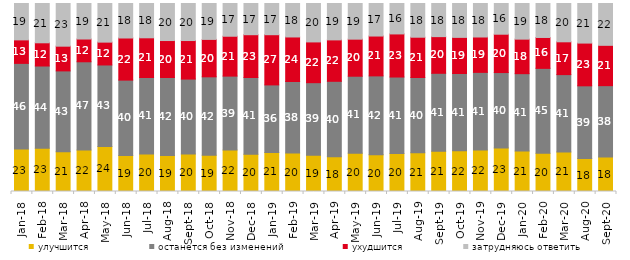
| Category | улучшится | останется без изменений | ухудшится | затрудняюсь ответить |
|---|---|---|---|---|
| 2018-01-01 | 22.55 | 45.6 | 12.5 | 19.35 |
| 2018-02-01 | 23 | 43.75 | 12.35 | 20.9 |
| 2018-03-01 | 21.15 | 43 | 13.15 | 22.7 |
| 2018-04-01 | 22.05 | 46.95 | 12.1 | 18.9 |
| 2018-05-01 | 23.95 | 43.35 | 12.15 | 20.55 |
| 2018-06-01 | 19.15 | 40.1 | 22.4 | 18.35 |
| 2018-07-01 | 19.95 | 40.7 | 21.1 | 18.25 |
| 2018-08-01 | 19.15 | 41.5 | 19.65 | 19.7 |
| 2018-09-01 | 19.95 | 39.85 | 20.5 | 19.7 |
| 2018-10-01 | 19.3 | 41.7 | 19.9 | 19.1 |
| 2018-11-01 | 22.056 | 39.321 | 21.208 | 17.415 |
| 2018-12-01 | 19.8 | 40.85 | 22.75 | 16.6 |
| 2019-01-01 | 20.75 | 35.95 | 26.7 | 16.6 |
| 2019-02-01 | 20.45 | 38.05 | 23.7 | 17.8 |
| 2019-03-01 | 19.344 | 38.538 | 21.681 | 20.438 |
| 2019-04-01 | 18.465 | 40.149 | 22.03 | 19.356 |
| 2019-05-01 | 20.406 | 40.911 | 19.713 | 18.97 |
| 2019-06-01 | 19.601 | 41.895 | 21.197 | 17.307 |
| 2019-07-01 | 20.149 | 40.743 | 22.921 | 16.188 |
| 2019-08-01 | 20.579 | 40.06 | 21.429 | 17.932 |
| 2019-09-01 | 21.386 | 41.485 | 19.505 | 17.624 |
| 2019-10-01 | 21.683 | 41.089 | 19.208 | 18.02 |
| 2019-11-01 | 22.03 | 41.337 | 18.812 | 17.822 |
| 2019-12-01 | 23.168 | 40.099 | 20.396 | 16.337 |
| 2020-01-01 | 21.485 | 41.188 | 18.366 | 18.96 |
| 2020-02-01 | 20.297 | 45.198 | 16.436 | 18.069 |
| 2020-03-01 | 21.071 | 41.101 | 17.452 | 20.377 |
| 2020-08-01 | 17.527 | 38.679 | 22.741 | 21.053 |
| 2020-09-01 | 18.318 | 37.979 | 21.453 | 22.25 |